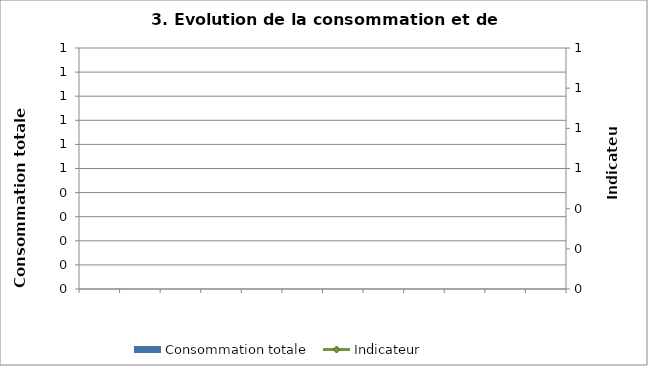
| Category | Consommation totale |
|---|---|
| 0 | 0 |
| 1 | 0 |
| 2 | 0 |
| 3 | 0 |
| 4 | 0 |
| 5 | 0 |
| 6 | 0 |
| 7 | 0 |
| 8 | 0 |
| 9 | 0 |
| 10 | 0 |
| 11 | 0 |